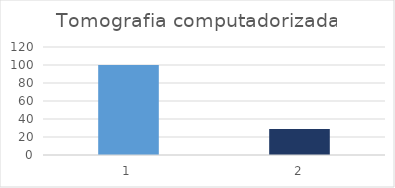
| Category | Tomografia computadorizada |
|---|---|
| 0 | 100 |
| 1 | 29 |